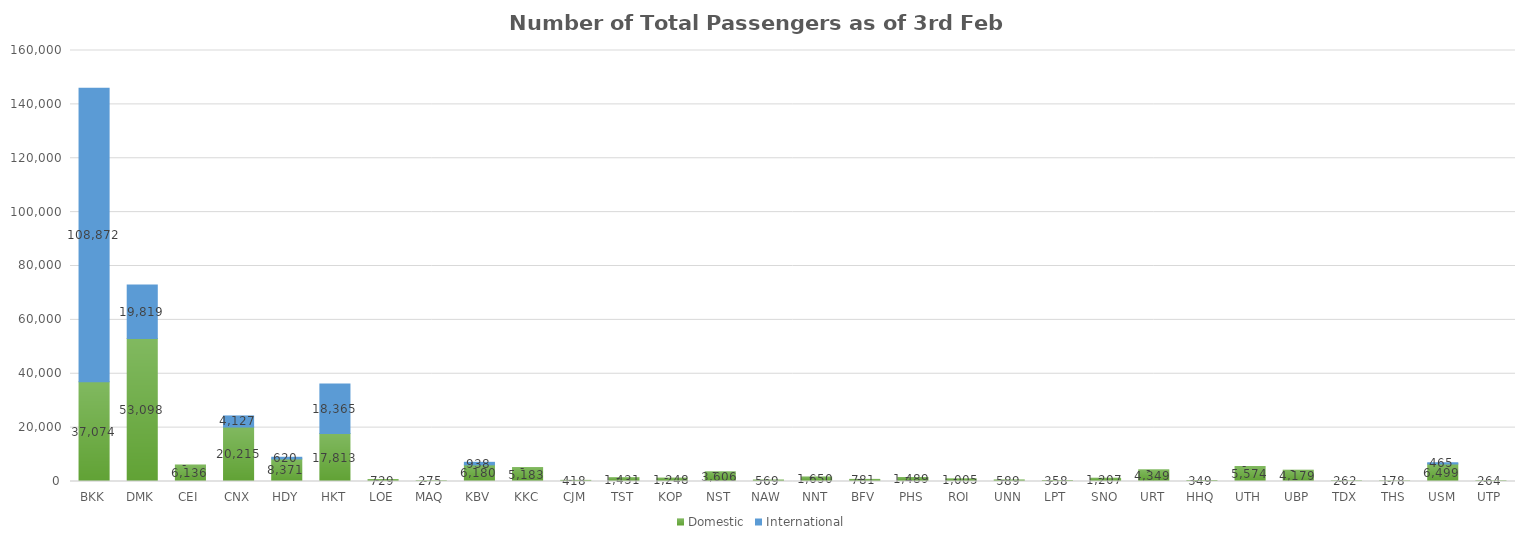
| Category | Domestic | International |
|---|---|---|
| BKK | 37074 | 108872 |
| DMK | 53098 | 19819 |
| CEI | 6136 | 0 |
| CNX | 20215 | 4127 |
| HDY | 8371 | 620 |
| HKT | 17813 | 18365 |
| LOE | 729 | 0 |
| MAQ | 275 | 0 |
| KBV | 6180 | 938 |
| KKC | 5183 | 0 |
| CJM | 418 | 0 |
| TST | 1431 | 0 |
| KOP | 1248 | 0 |
| NST | 3606 | 0 |
| NAW | 569 | 0 |
| NNT | 1650 | 0 |
| BFV | 781 | 0 |
| PHS | 1489 | 0 |
| ROI | 1005 | 0 |
| UNN | 589 | 0 |
| LPT | 358 | 0 |
| SNO | 1207 | 0 |
| URT | 4349 | 0 |
| HHQ | 349 | 0 |
| UTH | 5574 | 0 |
| UBP | 4179 | 0 |
| TDX | 262 | 0 |
| THS | 178 | 0 |
| USM | 6499 | 465 |
| UTP | 264 | 0 |